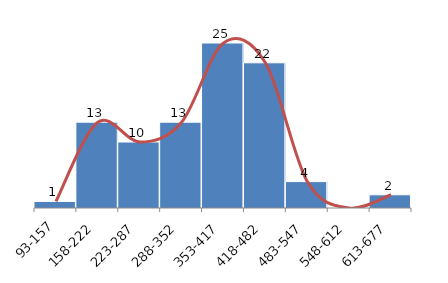
| Category | Series 0 |
|---|---|
| 93-157 | 1 |
| 158-222 | 13 |
| 223-287 | 10 |
| 288-352 | 13 |
| 353-417 | 25 |
| 418-482 | 22 |
| 483-547 | 4 |
| 548-612 | 0 |
| 613-677 | 2 |